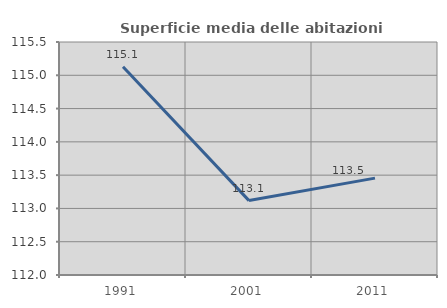
| Category | Superficie media delle abitazioni occupate |
|---|---|
| 1991.0 | 115.129 |
| 2001.0 | 113.118 |
| 2011.0 | 113.455 |